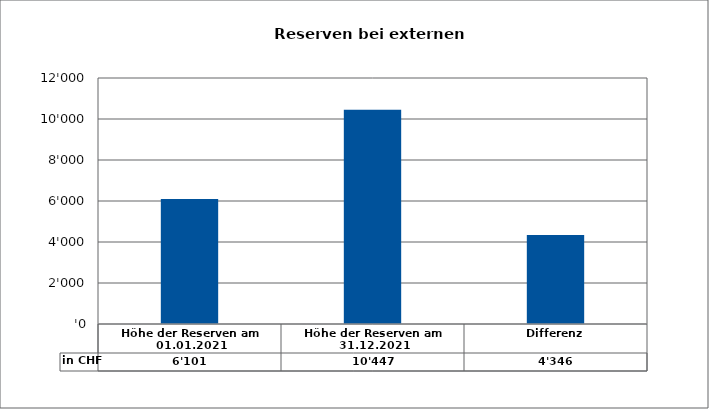
| Category | in CHF |
|---|---|
| Höhe der Reserven am 01.01.2021 | 6101 |
| Höhe der Reserven am 31.12.2021 | 10447 |
| Differenz | 4346 |